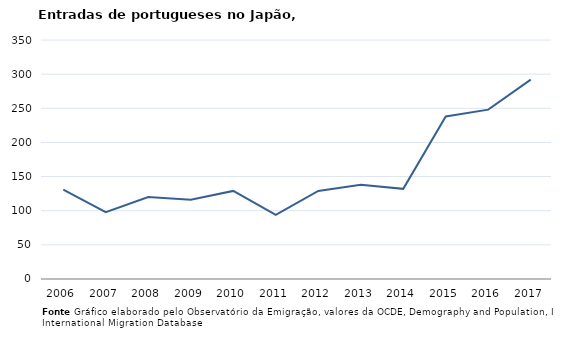
| Category | Entradas |
|---|---|
| 2006.0 | 131 |
| 2007.0 | 98 |
| 2008.0 | 120 |
| 2009.0 | 116 |
| 2010.0 | 129 |
| 2011.0 | 94 |
| 2012.0 | 129 |
| 2013.0 | 138 |
| 2014.0 | 132 |
| 2015.0 | 238 |
| 2016.0 | 248 |
| 2017.0 | 292 |